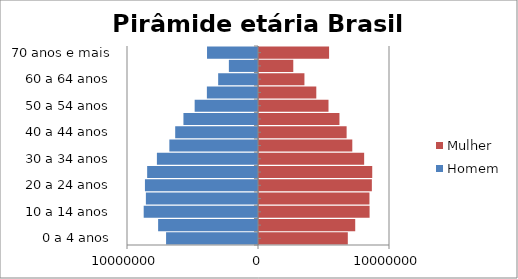
| Category | Homem | Mulher |
|---|---|---|
| 0 a 4 anos | -7016987 | 6779171 |
| 5 a 9 anos | -7624144 | 7345231 |
| 10 a 14 anos | -8725413 | 8441348 |
| 15 a 19 anos | -8558868 | 8432004 |
| 20 a 24 anos | -8630229 | 8614963 |
| 25 a 29 anos | -8460995 | 8643419 |
| 30 a 34 anos | -7717658 | 8026854 |
| 35 a 39 anos | -6766664 | 7121915 |
| 40 a 44 anos | -6320568 | 6688796 |
| 45 a 49 anos | -5692014 | 6141338 |
| 50 a 54 anos | -4834995 | 5305407 |
| 55 a 59 anos | -3902344 | 4373877 |
| 60 a 64 anos | -3041035 | 3468085 |
| 65 a 69 anos | -2224065 | 2616745 |
| 70 anos e mais | -3891011 | 5349656 |